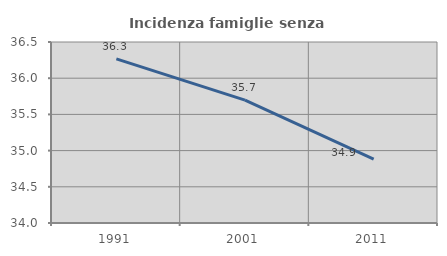
| Category | Incidenza famiglie senza nuclei |
|---|---|
| 1991.0 | 36.267 |
| 2001.0 | 35.697 |
| 2011.0 | 34.884 |